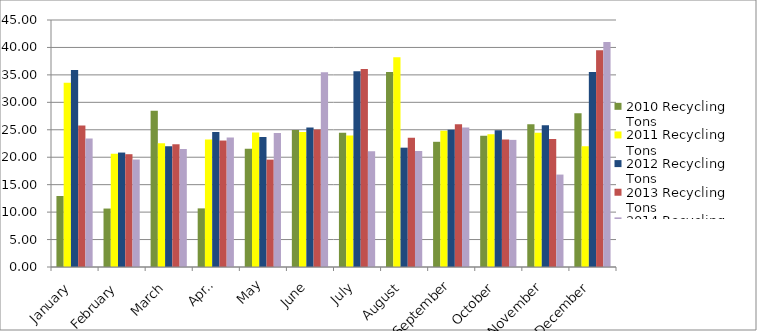
| Category | 2010 Recycling Tons | 2011 Recycling Tons | 2012 Recycling Tons | 2013 Recycling Tons | 2014 Recycling Tons |
|---|---|---|---|---|---|
| January | 12.94 | 33.59 | 35.91 | 25.78 | 23.39 |
| February | 10.65 | 20.64 | 20.85 | 20.55 | 19.58 |
| March | 28.47 | 22.55 | 22 | 22.36 | 21.5 |
| April | 10.68 | 23.21 | 24.6 | 23.04 | 23.59 |
| May | 21.54 | 24.51 | 23.67 | 19.56 | 24.4 |
| June | 24.97 | 24.61 | 25.42 | 25.07 | 35.5 |
| July | 24.44 | 23.95 | 35.66 | 36.06 | 21.11 |
| August | 35.53 | 38.23 | 21.74 | 23.56 | 21.15 |
| September | 22.81 | 24.82 | 24.99 | 25.99 | 25.43 |
| October | 23.93 | 24.2 | 24.92 | 23.24 | 23.16 |
| November | 26.01 | 24.45 | 25.81 | 23.34 | 16.84 |
| December | 28 | 22 | 35.52 | 39.51 | 41.01 |